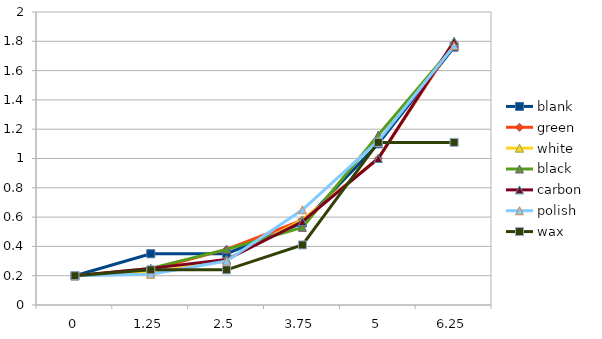
| Category | blank | green | white | black | carbon | polish | wax |
|---|---|---|---|---|---|---|---|
| 0 | 0.2 | 0.2 | 0.2 | 0.2 | 0.2 | 0.2 | 0.2 |
| 1.25 | 0.35 | 0.24 | 0.22 | 0.25 | 0.25 | 0.21 | 0.24 |
| 2.5 | 0.35 | 0.38 | 0.31 | 0.38 | 0.31 | 0.3 | 0.24 |
| 3.75 | 0.56 | 0.58 | 0.58 | 0.53 | 0.57 | 0.65 | 0.41 |
| 5 | 1.1 | 1 | 1 | 1.16 | 1 | 1.12 | 1.11 |
| 6.25 | 1.76 | 1.79 | 1.8 | 1.77 | 1.8 | 1.77 | 1.11 |